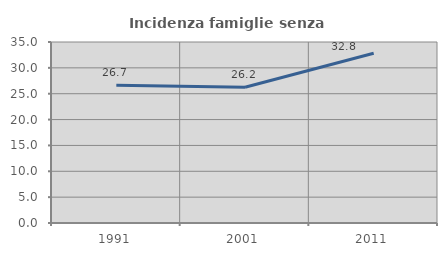
| Category | Incidenza famiglie senza nuclei |
|---|---|
| 1991.0 | 26.658 |
| 2001.0 | 26.244 |
| 2011.0 | 32.811 |